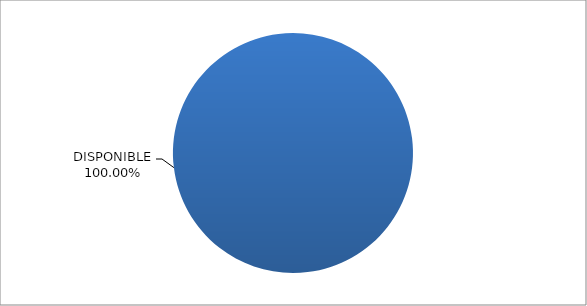
| Category | CODIGO DE AREA 8 |
|---|---|
| DISPONIBLE | 1 |